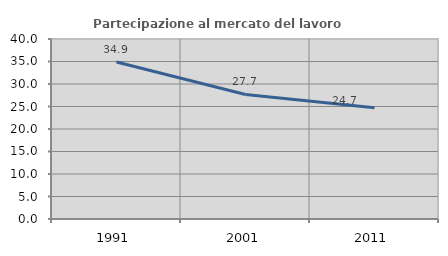
| Category | Partecipazione al mercato del lavoro  femminile |
|---|---|
| 1991.0 | 34.899 |
| 2001.0 | 27.68 |
| 2011.0 | 24.719 |